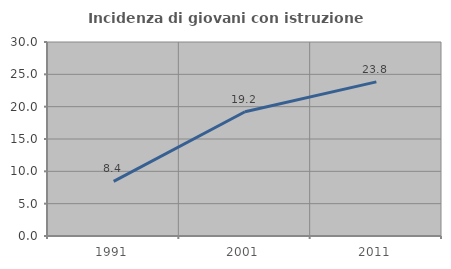
| Category | Incidenza di giovani con istruzione universitaria |
|---|---|
| 1991.0 | 8.442 |
| 2001.0 | 19.216 |
| 2011.0 | 23.834 |